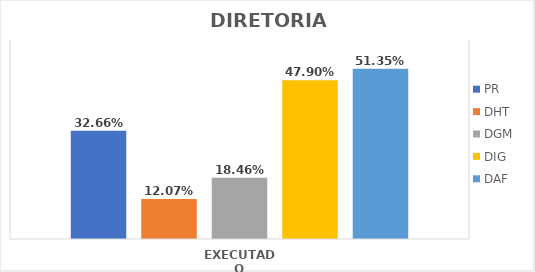
| Category | PR | DHT | DGM | DIG | DAF |
|---|---|---|---|---|---|
| EXECUTADO | 0.327 | 0.121 | 0.185 | 0.479 | 0.514 |